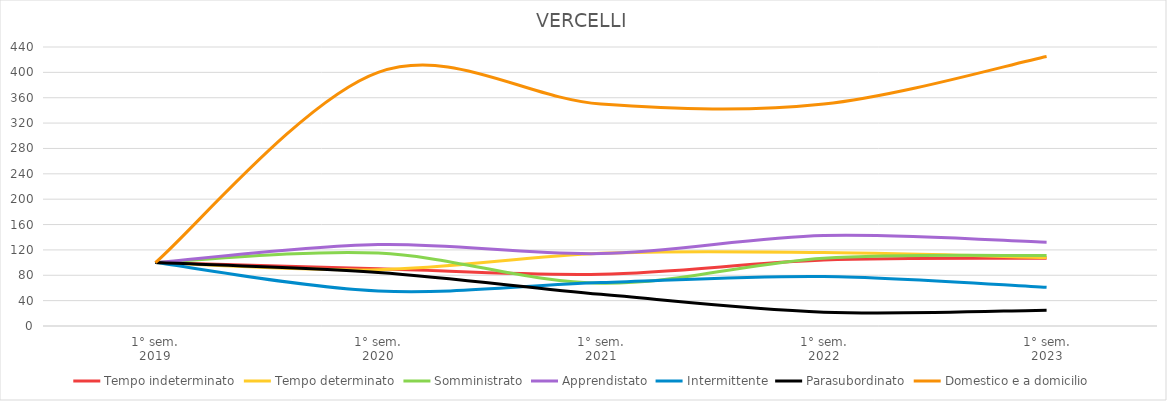
| Category | Tempo indeterminato | Tempo determinato | Somministrato | Apprendistato | Intermittente | Parasubordinato | Domestico e a domicilio |
|---|---|---|---|---|---|---|---|
| 1° sem.
2019 | 100 | 100 | 100 | 100 | 100 | 100 | 100 |
| 1° sem.
2020 | 90.286 | 88.787 | 115 | 128.571 | 55.238 | 84.375 | 400 |
| 1° sem.
2021 | 81.714 | 114.645 | 67.5 | 114.286 | 68.571 | 50 | 350 |
| 1° sem.
2022 | 104 | 115.789 | 106.875 | 142.857 | 78.095 | 21.875 | 350 |
| 1° sem.
2023 | 106.857 | 108.009 | 111.25 | 132.143 | 60.952 | 25 | 425 |